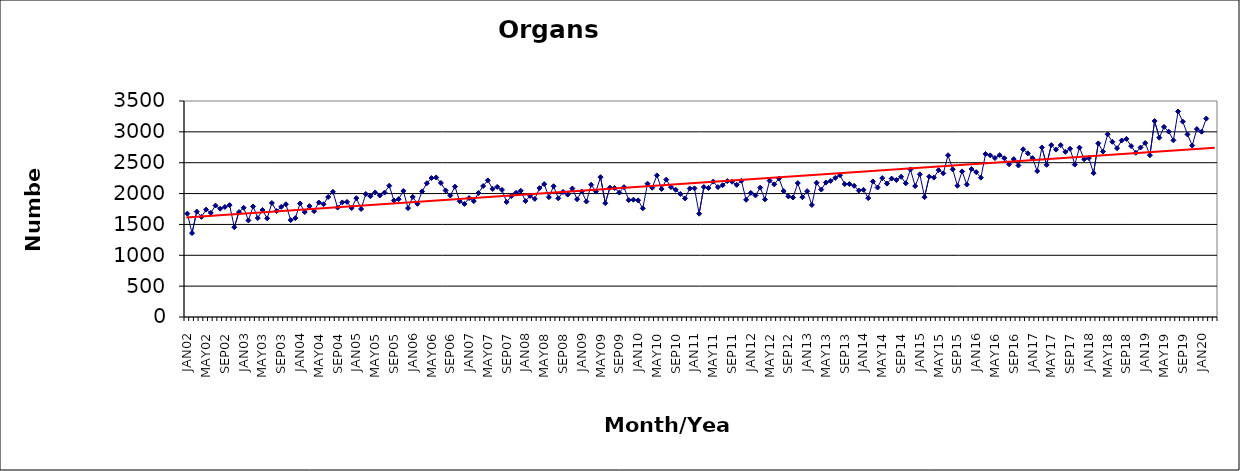
| Category | Series 0 |
|---|---|
| JAN02 | 1675 |
| FEB02 | 1360 |
| MAR02 | 1708 |
| APR02 | 1623 |
| MAY02 | 1740 |
| JUN02 | 1687 |
| JUL02 | 1806 |
| AUG02 | 1755 |
| SEP02 | 1783 |
| OCT02 | 1813 |
| NOV02 | 1455 |
| DEC02 | 1701 |
| JAN03 | 1770 |
| FEB03 | 1565 |
| MAR03 | 1791 |
| APR03 | 1603 |
| MAY03 | 1734 |
| JUN03 | 1598 |
| JUL03 | 1847 |
| AUG03 | 1716 |
| SEP03 | 1785 |
| OCT03 | 1827 |
| NOV03 | 1570 |
| DEC03 | 1602 |
| JAN04 | 1839 |
| FEB04 | 1700 |
| MAR04 | 1797 |
| APR04 | 1715 |
| MAY04 | 1855 |
| JUN04 | 1827 |
| JUL04 | 1945 |
| AUG04 | 2028 |
| SEP04 | 1773 |
| OCT04 | 1857 |
| NOV04 | 1864 |
| DEC04 | 1766 |
| JAN05 | 1925 |
| FEB05 | 1750 |
| MAR05 | 1993 |
| APR05 | 1957 |
| MAY05 | 2018 |
| JUN05 | 1969 |
| JUL05 | 2016 |
| AUG05 | 2127 |
| SEP05 | 1888 |
| OCT05 | 1910 |
| NOV05 | 2042 |
| DEC05 | 1764 |
| JAN06 | 1945 |
| FEB06 | 1834 |
| MAR06 | 2035 |
| APR06 | 2167 |
| MAY06 | 2252 |
| JUN06 | 2261 |
| JUL06 | 2172 |
| AUG06 | 2051 |
| SEP06 | 1969 |
| OCT06 | 2111 |
| NOV06 | 1875 |
| DEC06 | 1832 |
| JAN07 | 1927 |
| FEB07 | 1878 |
| MAR07 | 2009 |
| APR07 | 2122 |
| MAY07 | 2214 |
| JUN07 | 2076 |
| JUL07 | 2108 |
| AUG07 | 2060 |
| SEP07 | 1863 |
| OCT07 | 1959 |
| NOV07 | 2012 |
| DEC07 | 2046 |
| JAN08 | 1878 |
| FEB08 | 1962 |
| MAR08 | 1914 |
| APR08 | 2089 |
| MAY08 | 2153 |
| JUN08 | 1942 |
| JUL08 | 2119 |
| AUG08 | 1923 |
| SEP08 | 2026 |
| OCT08 | 1983 |
| NOV08 | 2082 |
| DEC08 | 1908 |
| JAN09 | 2033 |
| FEB09 | 1871 |
| MAR09 | 2143 |
| APR09 | 2032 |
| MAY09 | 2266 |
| JUN09 | 1844 |
| JUL09 | 2096 |
| AUG09 | 2089 |
| SEP09 | 2016 |
| OCT09 | 2104 |
| NOV09 | 1894 |
| DEC09 | 1901 |
| JAN10 | 1890 |
| FEB10 | 1761 |
| MAR10 | 2160 |
| APR10 | 2094 |
| MAY10 | 2295 |
| JUN10 | 2075 |
| JUL10 | 2226 |
| AUG10 | 2104 |
| SEP10 | 2062 |
| OCT10 | 1994 |
| NOV10 | 1922 |
| DEC10 | 2082 |
| JAN11 | 2085 |
| FEB11 | 1674 |
| MAR11 | 2106 |
| APR11 | 2090 |
| MAY11 | 2194 |
| JUN11 | 2105 |
| JUL11 | 2136 |
| AUG11 | 2202 |
| SEP11 | 2192 |
| OCT11 | 2142 |
| NOV11 | 2207 |
| DEC11 | 1899 |
| JAN12 | 2011 |
| FEB12 | 1970 |
| MAR12 | 2096 |
| APR12 | 1906 |
| MAY12 | 2210 |
| JUN12 | 2150 |
| JUL12 | 2244 |
| AUG12 | 2041 |
| SEP12 | 1954 |
| OCT12 | 1936 |
| NOV12 | 2170 |
| DEC12 | 1941 |
| JAN13 | 2039 |
| FEB13 | 1816 |
| MAR13 | 2175 |
| APR13 | 2065 |
| MAY13 | 2179 |
| JUN13 | 2205 |
| JUL13 | 2254 |
| AUG13 | 2297 |
| SEP13 | 2154 |
| OCT13 | 2154 |
| NOV13 | 2126 |
| DEC13 | 2049 |
| JAN14 | 2061 |
| FEB14 | 1927 |
| MAR14 | 2197 |
| APR14 | 2098 |
| MAY14 | 2251 |
| JUN14 | 2162 |
| JUL14 | 2243 |
| AUG14 | 2220 |
| SEP14 | 2272 |
| OCT14 | 2167 |
| NOV14 | 2391 |
| DEC14 | 2121 |
| JAN15 | 2312 |
| FEB15 | 1942 |
| MAR15 | 2275 |
| APR15 | 2259 |
| MAY15 | 2379 |
| JUN15 | 2328 |
| JUL15 | 2621 |
| AUG15 | 2393 |
| SEP15 | 2127 |
| OCT15 | 2359 |
| NOV15 | 2147 |
| DEC15 | 2398 |
| JAN16 | 2348 |
| FEB16 | 2258 |
| MAR16 | 2642 |
| APR16 | 2619 |
| MAY16 | 2576 |
| JUN16 | 2623 |
| JUL16 | 2573 |
| AUG16 | 2475 |
| SEP16 | 2559 |
| OCT16 | 2455 |
| NOV16 | 2717 |
| DEC16 | 2652 |
| JAN17 | 2574 |
| FEB17 | 2364 |
| MAR17 | 2747 |
| APR17 | 2466 |
| MAY17 | 2786 |
| JUN17 | 2712 |
| JUL17 | 2785 |
| AUG17 | 2676 |
| SEP17 | 2726 |
| OCT17 | 2470 |
| NOV17 | 2745 |
| DEC17 | 2557 |
| JAN18 | 2575 |
| FEB18 | 2331 |
| MAR18 | 2813 |
| APR18 | 2681 |
| MAY18 | 2960 |
| JUN18 | 2839 |
| JUL18 | 2735 |
| AUG18 | 2860 |
| SEP18 | 2886 |
| OCT18 | 2769 |
| NOV18 | 2661 |
| DEC18 | 2746 |
| JAN19 | 2819 |
| FEB19 | 2622 |
| MAR19 | 3175 |
| APR19 | 2906 |
| MAY19 | 3079 |
| JUN19 | 3004 |
| JUL19 | 2863 |
| AUG19 | 3330 |
| SEP19 | 3166 |
| OCT19 | 2958 |
| NOV19 | 2779 |
| DEC19 | 3045 |
| JAN20 | 3002 |
| FEB20 | 3215 |